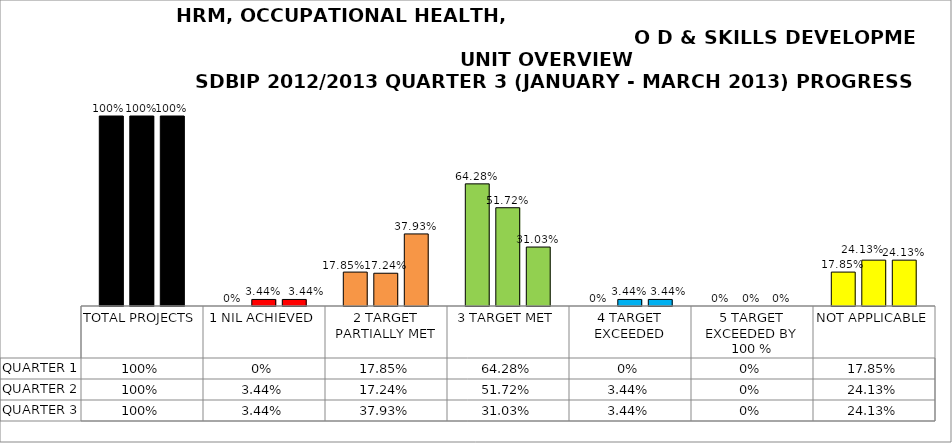
| Category | QUARTER 1 | QUARTER 2 | QUARTER 3 |
|---|---|---|---|
| TOTAL PROJECTS | 1 | 1 | 1 |
| 1 NIL ACHIEVED | 0 | 0.034 | 0.034 |
| 2 TARGET PARTIALLY MET | 0.178 | 0.172 | 0.379 |
| 3 TARGET MET | 0.643 | 0.517 | 0.31 |
| 4 TARGET EXCEEDED | 0 | 0.034 | 0.034 |
| 5 TARGET EXCEEDED BY 100 % | 0 | 0 | 0 |
| NOT APPLICABLE | 0.178 | 0.241 | 0.241 |